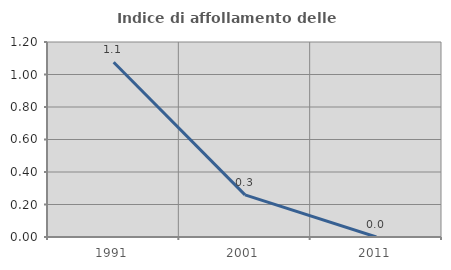
| Category | Indice di affollamento delle abitazioni  |
|---|---|
| 1991.0 | 1.075 |
| 2001.0 | 0.259 |
| 2011.0 | 0 |